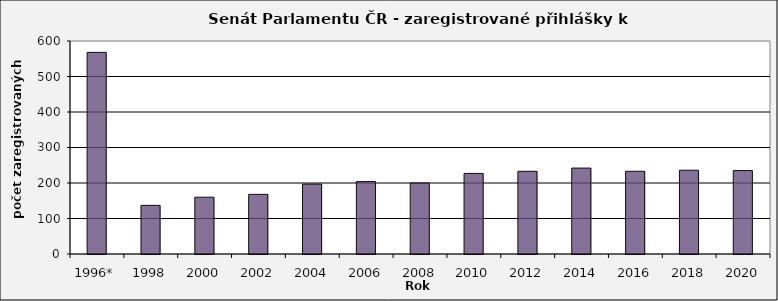
| Category | Počet zaregistrovaných přihlášek k registraci - celkem |
|---|---|
| 1996* | 568 |
| 1998 | 137 |
| 2000 | 160 |
| 2002 | 168 |
| 2004 | 197 |
| 2006 | 204 |
| 2008 | 200 |
| 2010 | 227 |
| 2012 | 233 |
| 2014 | 242 |
| 2016 | 233 |
| 2018 | 236 |
| 2020 | 235 |